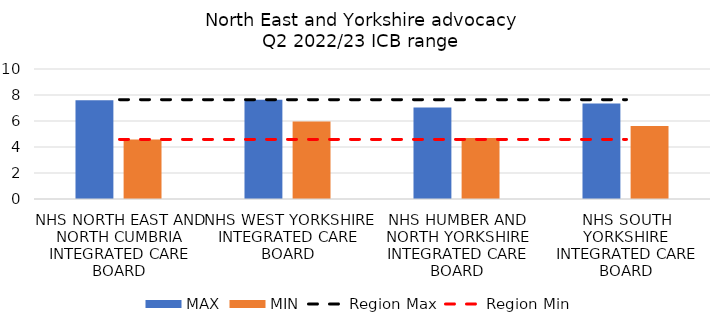
| Category | MAX | MIN |
|---|---|---|
| NHS NORTH EAST AND NORTH CUMBRIA INTEGRATED CARE BOARD | 7.603 | 4.583 |
| NHS WEST YORKSHIRE INTEGRATED CARE BOARD | 7.644 | 5.966 |
| NHS HUMBER AND NORTH YORKSHIRE INTEGRATED CARE BOARD | 7.029 | 4.688 |
| NHS SOUTH YORKSHIRE INTEGRATED CARE BOARD | 7.339 | 5.614 |